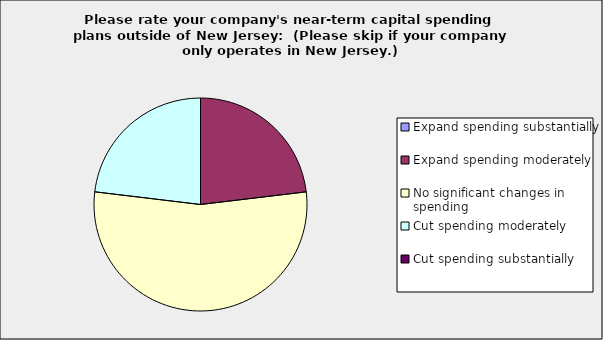
| Category | Series 0 |
|---|---|
| Expand spending substantially | 0 |
| Expand spending moderately | 0.231 |
| No significant changes in spending | 0.538 |
| Cut spending moderately | 0.231 |
| Cut spending substantially | 0 |